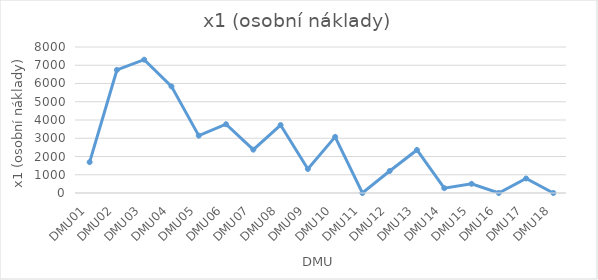
| Category | x1 (osobní náklady) |
|---|---|
| DMU01 | 1691 |
| DMU02 | 6742 |
| DMU03 | 7305 |
| DMU04 | 5842 |
| DMU05 | 3143 |
| DMU06 | 3768 |
| DMU07 | 2374 |
| DMU08 | 3724 |
| DMU09 | 1317 |
| DMU10 | 3075 |
| DMU11 | 0 |
| DMU12 | 1207 |
| DMU13 | 2359 |
| DMU14 | 265 |
| DMU15 | 503 |
| DMU16 | 0 |
| DMU17 | 794 |
| DMU18 | 0 |